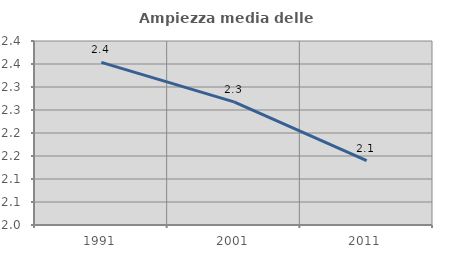
| Category | Ampiezza media delle famiglie |
|---|---|
| 1991.0 | 2.353 |
| 2001.0 | 2.268 |
| 2011.0 | 2.14 |